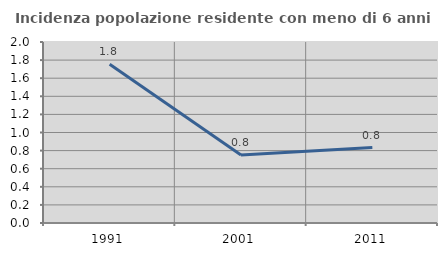
| Category | Incidenza popolazione residente con meno di 6 anni |
|---|---|
| 1991.0 | 1.754 |
| 2001.0 | 0.752 |
| 2011.0 | 0.833 |